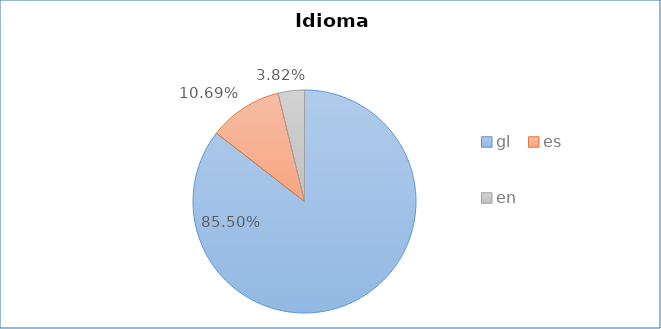
| Category | Idioma empregado |
|---|---|
| gl | 0.855 |
| es | 0.107 |
| en | 0.038 |